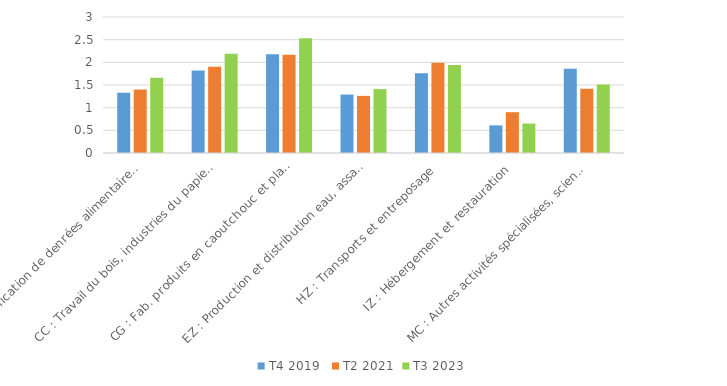
| Category | T4 2019  | T2 2021 | T3 2023 |
|---|---|---|---|
| CA : Fabrication de denrées alimentaires, boissons et produits à base de tabac | 1.33 | 1.4 | 1.66 |
| CC : Travail du bois, industries du papier et imprimerie | 1.82 | 1.9 | 2.19 |
| CG : Fab. produits en caoutchouc et plastique et autres produits minéraux non métalliques | 2.18 | 2.17 | 2.53 |
| EZ : Production et distribution eau, assainissement, gestion des déchets et dépollution | 1.29 | 1.26 | 1.41 |
| HZ : Transports et entreposage | 1.76 | 1.99 | 1.94 |
| IZ : Hébergement et restauration | 0.61 | 0.9 | 0.65 |
| MC : Autres activités spécialisées, scientifiques et techniques | 1.86 | 1.42 | 1.51 |